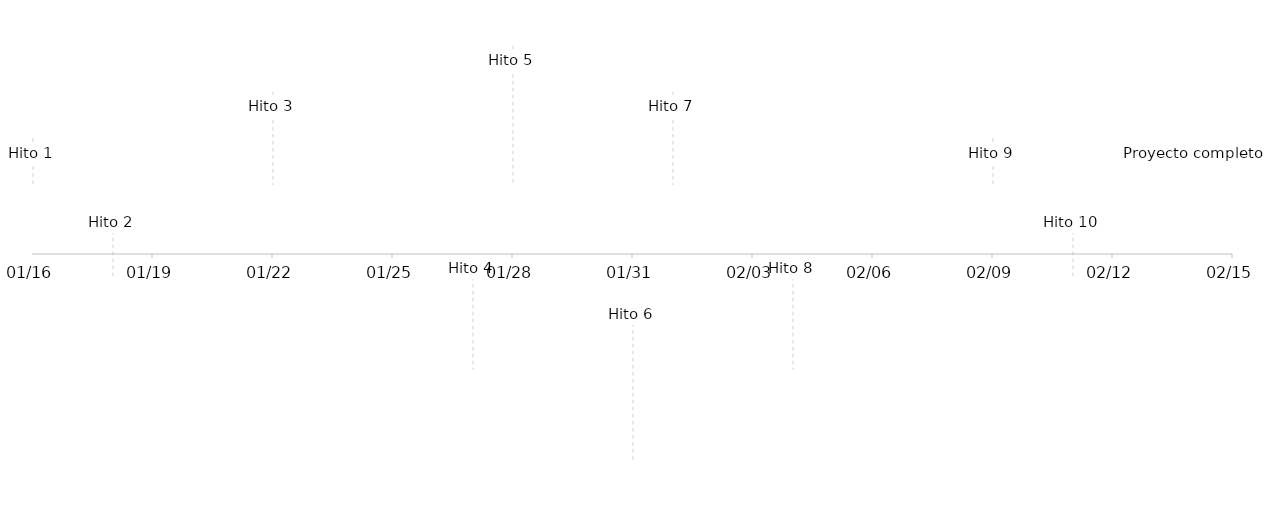
| Category | Series 1 |
|---|---|
| Hito 1 | 5 |
| Hito 2 | -5 |
| Hito 3 | 10 |
| Hito 4 | -10 |
| Hito 5 | 15 |
| Hito 6 | -15 |
| Hito 7 | 10 |
| Hito 8 | -10 |
| Hito 9 | 5 |
| Hito 10 | -5 |
| Proyecto completo | 5 |